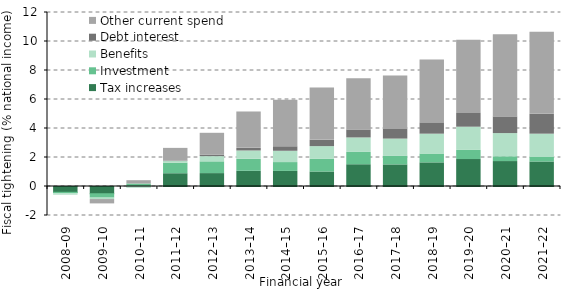
| Category | Tax increases | Investment | Benefits | Debt interest | Other current spend |
|---|---|---|---|---|---|
| 2008–09 | -0.4 | -0.1 | -0.1 | 0 | 0 |
| 2009–10 | -0.5 | -0.3 | -0.1 | 0 | -0.3 |
| 2010–11 | -0.01 | 0.17 | -0.1 | 0 | 0.23 |
| 2011–12 | 0.88 | 0.73 | 0.11 | 0.03 | 0.88 |
| 2012–13 | 0.89 | 0.81 | 0.36 | 0.09 | 1.52 |
| 2013–14 | 1.05 | 0.83 | 0.57 | 0.18 | 2.51 |
| 2014–15 | 1.04 | 0.61 | 0.78 | 0.31 | 3.2 |
| 2015–16 | 1 | 0.87 | 0.88 | 0.45 | 3.59 |
| 2016–17 | 1.5 | 0.85 | 1 | 0.55 | 3.53 |
| 2017–18 | 1.49 | 0.61 | 1.17 | 0.66 | 3.69 |
| 2018–19 | 1.63 | 0.61 | 1.37 | 0.78 | 4.34 |
| 2019–20 | 1.86 | 0.63 | 1.6 | 0.95 | 5.05 |
| 2020–21 | 1.72 | 0.33 | 1.6 | 1.15 | 5.66 |
| 2021–22 | 1.69 | 0.31 | 1.61 | 1.37 | 5.65 |